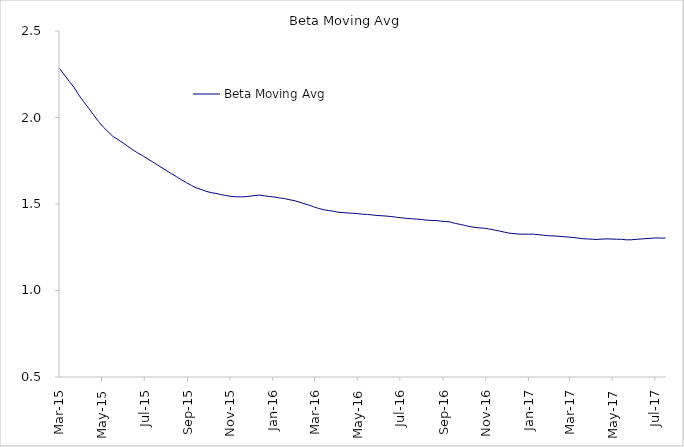
| Category | Beta Moving Avg |
|---|---|
| 2015-03-14 | 2.284 |
| 2015-03-21 | 2.247 |
| 2015-03-28 | 2.21 |
| 2015-04-04 | 2.174 |
| 2015-04-11 | 2.129 |
| 2015-04-18 | 2.091 |
| 2015-04-25 | 2.054 |
| 2015-05-02 | 2.015 |
| 2015-05-09 | 1.977 |
| 2015-05-16 | 1.945 |
| 2015-05-23 | 1.917 |
| 2015-05-30 | 1.889 |
| 2015-06-06 | 1.873 |
| 2015-06-13 | 1.853 |
| 2015-06-20 | 1.833 |
| 2015-06-27 | 1.814 |
| 2015-07-04 | 1.795 |
| 2015-07-11 | 1.78 |
| 2015-07-18 | 1.762 |
| 2015-07-25 | 1.745 |
| 2015-08-01 | 1.727 |
| 2015-08-08 | 1.709 |
| 2015-08-15 | 1.691 |
| 2015-08-22 | 1.674 |
| 2015-08-29 | 1.657 |
| 2015-09-05 | 1.639 |
| 2015-09-12 | 1.623 |
| 2015-09-19 | 1.607 |
| 2015-09-26 | 1.593 |
| 2015-10-03 | 1.584 |
| 2015-10-10 | 1.574 |
| 2015-10-17 | 1.566 |
| 2015-10-24 | 1.561 |
| 2015-10-31 | 1.555 |
| 2015-11-07 | 1.549 |
| 2015-11-14 | 1.544 |
| 2015-11-21 | 1.542 |
| 2015-11-28 | 1.541 |
| 2015-12-05 | 1.542 |
| 2015-12-12 | 1.545 |
| 2015-12-19 | 1.549 |
| 2015-12-26 | 1.551 |
| 2016-01-02 | 1.547 |
| 2016-01-09 | 1.543 |
| 2016-01-16 | 1.54 |
| 2016-01-23 | 1.535 |
| 2016-01-30 | 1.531 |
| 2016-02-06 | 1.525 |
| 2016-02-13 | 1.52 |
| 2016-02-20 | 1.512 |
| 2016-02-27 | 1.502 |
| 2016-03-05 | 1.494 |
| 2016-03-12 | 1.484 |
| 2016-03-19 | 1.475 |
| 2016-03-26 | 1.467 |
| 2016-04-02 | 1.462 |
| 2016-04-09 | 1.458 |
| 2016-04-16 | 1.453 |
| 2016-04-23 | 1.45 |
| 2016-04-30 | 1.448 |
| 2016-05-07 | 1.447 |
| 2016-05-14 | 1.444 |
| 2016-05-21 | 1.441 |
| 2016-05-28 | 1.44 |
| 2016-06-04 | 1.437 |
| 2016-06-11 | 1.434 |
| 2016-06-18 | 1.432 |
| 2016-06-25 | 1.43 |
| 2016-07-02 | 1.427 |
| 2016-07-09 | 1.423 |
| 2016-07-16 | 1.42 |
| 2016-07-23 | 1.417 |
| 2016-07-30 | 1.415 |
| 2016-08-06 | 1.413 |
| 2016-08-13 | 1.41 |
| 2016-08-20 | 1.407 |
| 2016-08-27 | 1.405 |
| 2016-09-03 | 1.405 |
| 2016-09-10 | 1.401 |
| 2016-09-17 | 1.399 |
| 2016-09-24 | 1.396 |
| 2016-10-01 | 1.388 |
| 2016-10-08 | 1.382 |
| 2016-10-15 | 1.376 |
| 2016-10-22 | 1.37 |
| 2016-10-29 | 1.365 |
| 2016-11-05 | 1.362 |
| 2016-11-12 | 1.36 |
| 2016-11-19 | 1.355 |
| 2016-11-26 | 1.35 |
| 2016-12-03 | 1.344 |
| 2016-12-10 | 1.337 |
| 2016-12-17 | 1.331 |
| 2016-12-24 | 1.329 |
| 2016-12-31 | 1.326 |
| 2017-01-07 | 1.326 |
| 2017-01-14 | 1.325 |
| 2017-01-21 | 1.326 |
| 2017-01-28 | 1.322 |
| 2017-02-04 | 1.32 |
| 2017-02-11 | 1.316 |
| 2017-02-18 | 1.316 |
| 2017-02-25 | 1.314 |
| 2017-03-04 | 1.311 |
| 2017-03-11 | 1.309 |
| 2017-03-18 | 1.307 |
| 2017-03-25 | 1.304 |
| 2017-04-01 | 1.299 |
| 2017-04-08 | 1.298 |
| 2017-04-15 | 1.296 |
| 2017-04-22 | 1.295 |
| 2017-04-29 | 1.297 |
| 2017-05-06 | 1.298 |
| 2017-05-13 | 1.297 |
| 2017-05-20 | 1.296 |
| 2017-05-27 | 1.296 |
| 2017-06-03 | 1.293 |
| 2017-06-10 | 1.293 |
| 2017-06-17 | 1.295 |
| 2017-06-24 | 1.298 |
| 2017-07-01 | 1.3 |
| 2017-07-08 | 1.302 |
| 2017-07-15 | 1.304 |
| 2017-07-22 | 1.303 |
| 2017-07-29 | 1.303 |